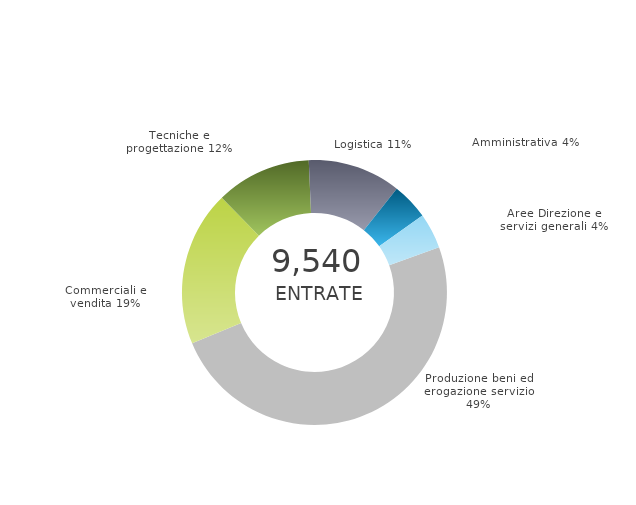
| Category | Series 0 | Series 1 |
|---|---|---|
| Produzione beni ed erogazione servizio | 0 | 0.493 |
| Commerciali e vendita | 0 | 0.189 |
| Tecniche e progettazione | 0 | 0.116 |
| Logistica | 0 | 0.114 |
| Amministrativa | 0 | 0.045 |
| Aree Direzione e servizi generali | 0 | 0.043 |